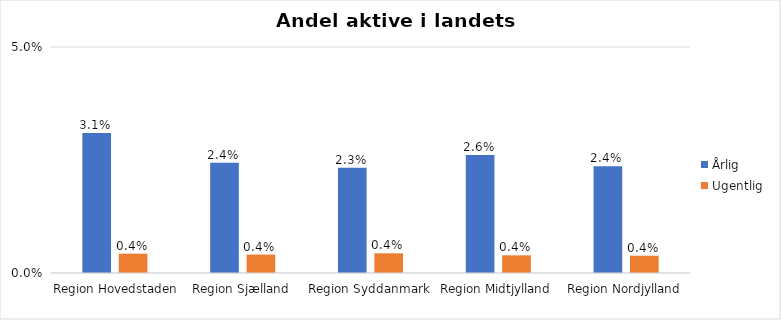
| Category | Årlig | Ugentlig |
|---|---|---|
| Region Hovedstaden | 0.031 | 0.004 |
| Region Sjælland | 0.024 | 0.004 |
| Region Syddanmark | 0.023 | 0.004 |
| Region Midtjylland | 0.026 | 0.004 |
| Region Nordjylland | 0.024 | 0.004 |